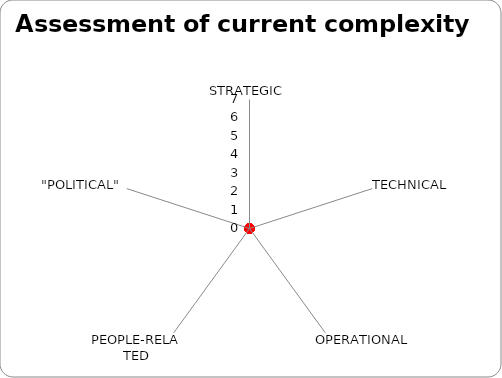
| Category | Agree score |
|---|---|
| STRATEGIC | 0 |
| TECHNICAL | 0 |
| OPERATIONAL | 0 |
| PEOPLE-RELATED | 0 |
| "POLITICAL" | 0 |